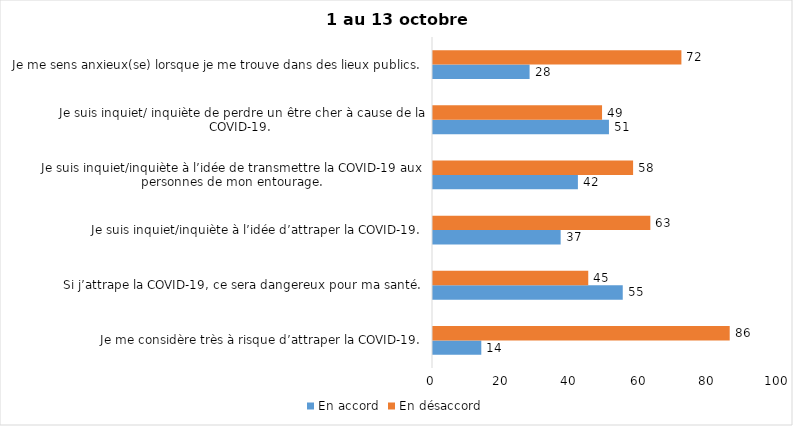
| Category | En accord | En désaccord |
|---|---|---|
| Je me considère très à risque d’attraper la COVID-19. | 14 | 86 |
| Si j’attrape la COVID-19, ce sera dangereux pour ma santé. | 55 | 45 |
| Je suis inquiet/inquiète à l’idée d’attraper la COVID-19. | 37 | 63 |
| Je suis inquiet/inquiète à l’idée de transmettre la COVID-19 aux personnes de mon entourage. | 42 | 58 |
| Je suis inquiet/ inquiète de perdre un être cher à cause de la COVID-19. | 51 | 49 |
| Je me sens anxieux(se) lorsque je me trouve dans des lieux publics. | 28 | 72 |